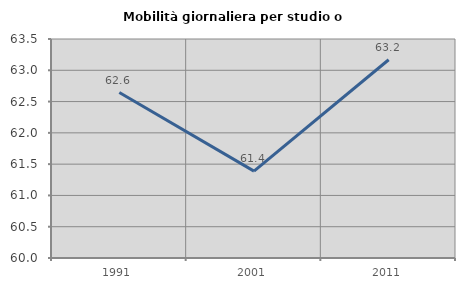
| Category | Mobilità giornaliera per studio o lavoro |
|---|---|
| 1991.0 | 62.645 |
| 2001.0 | 61.389 |
| 2011.0 | 63.168 |